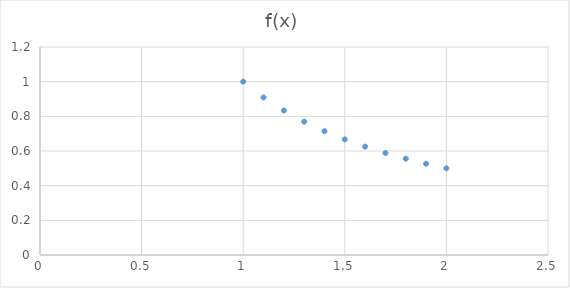
| Category | f(x) |
|---|---|
| 1.0 | 1 |
| 1.1 | 0.909 |
| 1.2 | 0.833 |
| 1.3 | 0.769 |
| 1.4 | 0.714 |
| 1.5 | 0.667 |
| 1.6 | 0.625 |
| 1.7 | 0.588 |
| 1.8 | 0.556 |
| 1.9 | 0.526 |
| 2.0 | 0.5 |